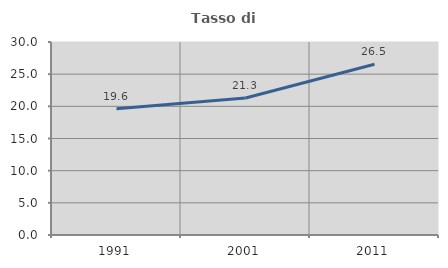
| Category | Tasso di occupazione   |
|---|---|
| 1991.0 | 19.635 |
| 2001.0 | 21.303 |
| 2011.0 | 26.535 |